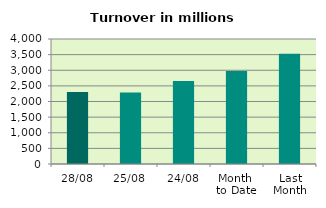
| Category | Series 0 |
|---|---|
| 28/08 | 2305.905 |
| 25/08 | 2285.688 |
| 24/08 | 2657.329 |
| Month 
to Date | 2973.387 |
| Last
Month | 3531.02 |